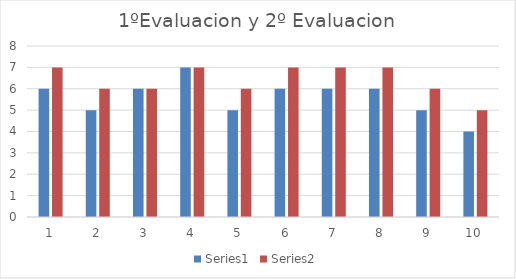
| Category | Series 0 | Series 1 |
|---|---|---|
| 0 | 6 | 7 |
| 1 | 5 | 6 |
| 2 | 6 | 6 |
| 3 | 7 | 7 |
| 4 | 5 | 6 |
| 5 | 6 | 7 |
| 6 | 6 | 7 |
| 7 | 6 | 7 |
| 8 | 5 | 6 |
| 9 | 4 | 5 |